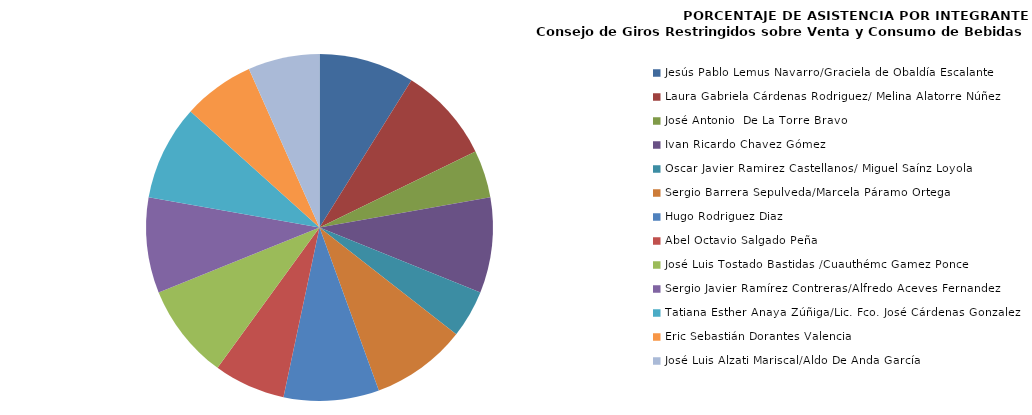
| Category | Series 0 |
|---|---|
| Jesús Pablo Lemus Navarro/Graciela de Obaldía Escalante | 100 |
| Laura Gabriela Cárdenas Rodriguez/ Melina Alatorre Núñez | 100 |
| José Antonio  De La Torre Bravo | 50 |
| Ivan Ricardo Chavez Gómez | 100 |
| Oscar Javier Ramirez Castellanos/ Miguel Saínz Loyola | 50 |
| Sergio Barrera Sepulveda/Marcela Páramo Ortega | 100 |
| Hugo Rodriguez Diaz | 100 |
| Abel Octavio Salgado Peña | 75 |
| José Luis Tostado Bastidas /Cuauthémc Gamez Ponce | 100 |
| Sergio Javier Ramírez Contreras/Alfredo Aceves Fernandez | 100 |
| Tatiana Esther Anaya Zúñiga/Lic. Fco. José Cárdenas Gonzalez | 100 |
| Eric Sebastián Dorantes Valencia | 75 |
| José Luis Alzati Mariscal/Aldo De Anda García | 75 |